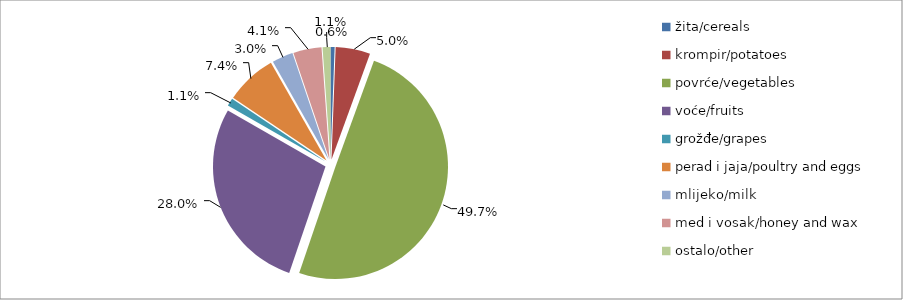
| Category | Series 0 |
|---|---|
| žita/cereals | 13107 |
| krompir/potatoes | 110518 |
| povrće/vegetables | 1105033.5 |
| voće/fruits | 623982 |
| grožđe/grapes | 25150 |
| perad i jaja/poultry and eggs | 163858 |
| mlijeko/milk | 67386 |
| med i vosak/honey and wax | 90410 |
| ostalo/other | 25180 |